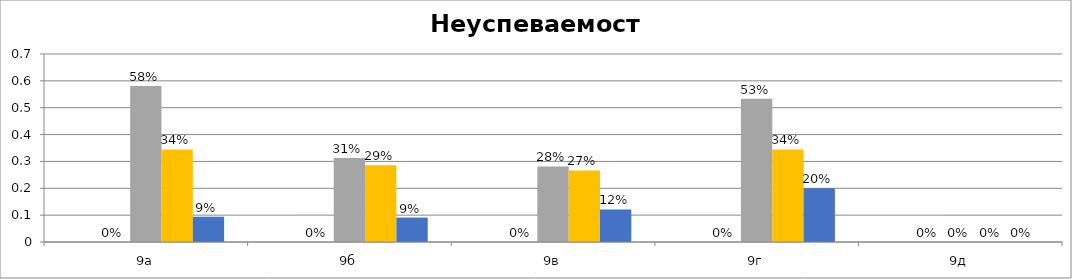
| Category | Series 0 | Series 1 | Series 2 | Series 3 | Series 4 |
|---|---|---|---|---|---|
| 9а |  | 0 | 0.581 | 0.345 | 0.094 |
| 9б |  | 0 | 0.312 | 0.286 | 0.091 |
| 9в |  | 0 | 0.281 | 0.267 | 0.121 |
| 9г |  | 0 | 0.533 | 0.345 | 0.2 |
| 9д |  | 0 | 0 | 0 | 0 |